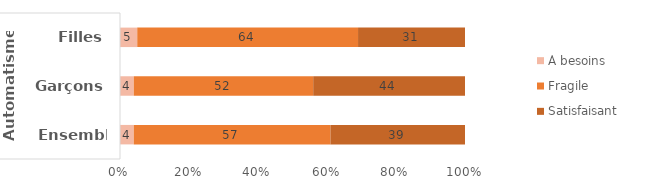
| Category | À besoins | Fragile | Satisfaisant |
|---|---|---|---|
| 0 | 4 | 57 | 39 |
| 1 | 4 | 52 | 44 |
| 2 | 5 | 64 | 31 |